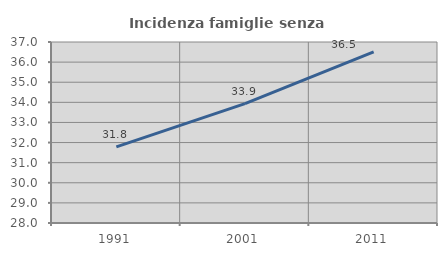
| Category | Incidenza famiglie senza nuclei |
|---|---|
| 1991.0 | 31.788 |
| 2001.0 | 33.937 |
| 2011.0 | 36.508 |